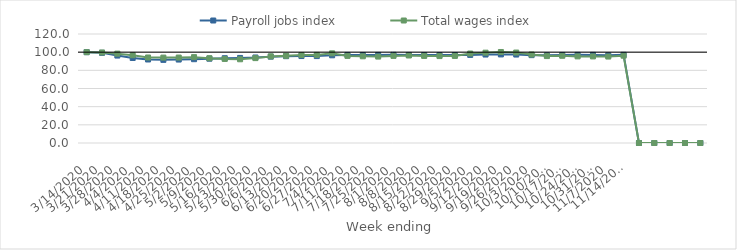
| Category | Payroll jobs index | Total wages index |
|---|---|---|
| 14/03/2020 | 100 | 100 |
| 21/03/2020 | 99.252 | 99.658 |
| 28/03/2020 | 96.25 | 98.378 |
| 04/04/2020 | 93.61 | 96.634 |
| 11/04/2020 | 91.936 | 94.139 |
| 18/04/2020 | 91.515 | 94.01 |
| 25/04/2020 | 91.861 | 94.076 |
| 02/05/2020 | 92.263 | 94.531 |
| 09/05/2020 | 92.818 | 93.346 |
| 16/05/2020 | 93.348 | 92.542 |
| 23/05/2020 | 93.657 | 92.17 |
| 30/05/2020 | 94.157 | 93.446 |
| 06/06/2020 | 95.081 | 95.354 |
| 13/06/2020 | 95.581 | 96.009 |
| 20/06/2020 | 95.73 | 96.914 |
| 27/06/2020 | 95.677 | 96.999 |
| 04/07/2020 | 96.551 | 98.71 |
| 11/07/2020 | 96.956 | 95.878 |
| 18/07/2020 | 96.874 | 95.454 |
| 25/07/2020 | 96.966 | 95.136 |
| 01/08/2020 | 97.062 | 95.894 |
| 08/08/2020 | 96.936 | 96.337 |
| 15/08/2020 | 96.797 | 95.858 |
| 22/08/2020 | 96.815 | 95.687 |
| 29/08/2020 | 96.851 | 95.834 |
| 05/09/2020 | 96.995 | 98.49 |
| 12/09/2020 | 97.381 | 99.44 |
| 19/09/2020 | 97.514 | 100.193 |
| 26/09/2020 | 97.375 | 99.575 |
| 03/10/2020 | 96.725 | 97.427 |
| 10/10/2020 | 96.517 | 95.692 |
| 17/10/2020 | 96.926 | 96.016 |
| 24/10/2020 | 97.027 | 95.365 |
| 31/10/2020 | 97.003 | 95.32 |
| 07/11/2020 | 96.523 | 95.17 |
| 14/11/2020 | 97.067 | 96.091 |